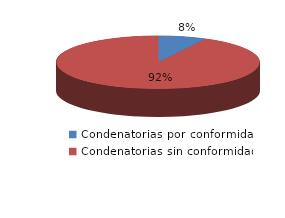
| Category | Series 0 |
|---|---|
| 0 | 1 |
| 1 | 12 |